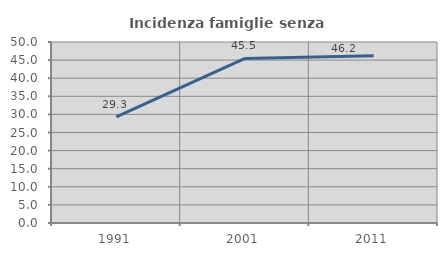
| Category | Incidenza famiglie senza nuclei |
|---|---|
| 1991.0 | 29.329 |
| 2001.0 | 45.455 |
| 2011.0 | 46.175 |